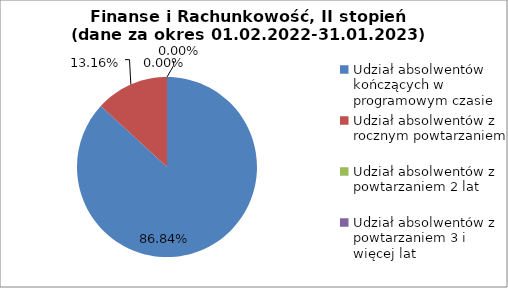
| Category | Series 0 |
|---|---|
| Udział absolwentów kończących w programowym czasie | 86.842 |
| Udział absolwentów z rocznym powtarzaniem | 13.158 |
| Udział absolwentów z powtarzaniem 2 lat | 0 |
| Udział absolwentów z powtarzaniem 3 i więcej lat | 0 |